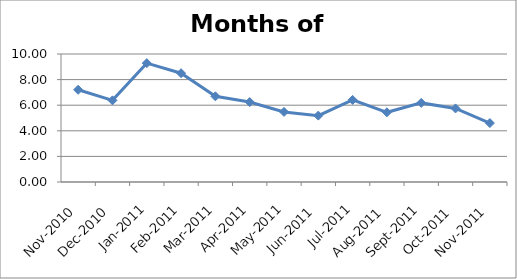
| Category | Series 0 |
|---|---|
| 2010-11-01 | 7.207 |
| 2010-12-01 | 6.379 |
| 2011-01-01 | 9.284 |
| 2011-02-01 | 8.5 |
| 2011-03-01 | 6.692 |
| 2011-04-01 | 6.244 |
| 2011-05-01 | 5.474 |
| 2011-06-01 | 5.186 |
| 2011-07-01 | 6.415 |
| 2011-08-01 | 5.444 |
| 2011-09-01 | 6.179 |
| 2011-10-01 | 5.747 |
| 2011-11-01 | 4.602 |